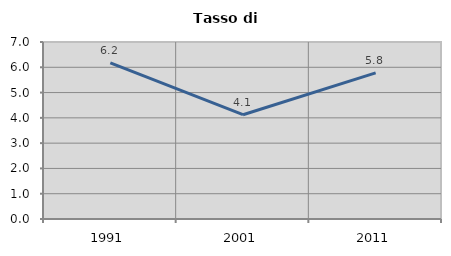
| Category | Tasso di disoccupazione   |
|---|---|
| 1991.0 | 6.172 |
| 2001.0 | 4.124 |
| 2011.0 | 5.778 |